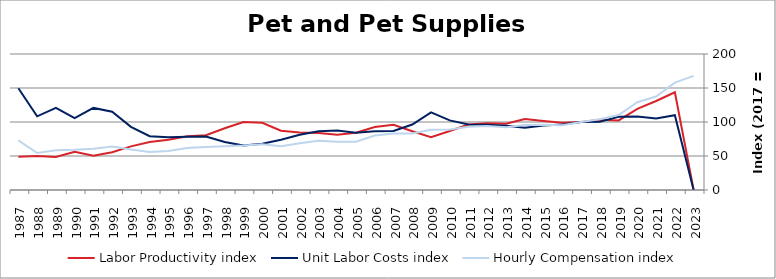
| Category | Labor Productivity index | Unit Labor Costs index | Hourly Compensation index |
|---|---|---|---|
| 2023.0 | 0 | 0 | 167.86 |
| 2022.0 | 143.663 | 109.898 | 157.882 |
| 2021.0 | 130.85 | 105.028 | 137.429 |
| 2020.0 | 119.413 | 108.161 | 129.158 |
| 2019.0 | 102.287 | 107.839 | 110.306 |
| 2018.0 | 103.461 | 100.489 | 103.966 |
| 2017.0 | 100 | 100 | 100 |
| 2016.0 | 98.8 | 96.414 | 95.257 |
| 2015.0 | 101.353 | 94.781 | 96.063 |
| 2014.0 | 104.391 | 91.651 | 95.676 |
| 2013.0 | 97.398 | 94.639 | 92.177 |
| 2012.0 | 98.152 | 96.026 | 94.252 |
| 2011.0 | 96.368 | 96.363 | 92.863 |
| 2010.0 | 86.851 | 102.331 | 88.876 |
| 2009.0 | 77.667 | 114.043 | 88.574 |
| 2008.0 | 86.406 | 96.242 | 83.159 |
| 2007.0 | 95.78 | 86.872 | 83.205 |
| 2006.0 | 92.64 | 86.439 | 80.077 |
| 2005.0 | 84.197 | 84.25 | 70.936 |
| 2004.0 | 81.286 | 87.359 | 71.011 |
| 2003.0 | 83.858 | 86.26 | 72.336 |
| 2002.0 | 84.494 | 81.213 | 68.62 |
| 2001.0 | 87.267 | 73.92 | 64.508 |
| 2000.0 | 98.875 | 68.101 | 67.334 |
| 1999.0 | 99.939 | 65.429 | 65.389 |
| 1998.0 | 90.792 | 70.713 | 64.202 |
| 1997.0 | 80.471 | 78.704 | 63.333 |
| 1996.0 | 78.899 | 78.226 | 61.72 |
| 1995.0 | 73.876 | 77.546 | 57.288 |
| 1994.0 | 70.672 | 79.177 | 55.956 |
| 1993.0 | 64.148 | 92.971 | 59.639 |
| 1992.0 | 55.488 | 115.124 | 63.88 |
| 1991.0 | 50.347 | 120.701 | 60.769 |
| 1990.0 | 56.145 | 105.676 | 59.332 |
| 1989.0 | 48.536 | 120.674 | 58.57 |
| 1988.0 | 50.141 | 108.396 | 54.35 |
| 1987.0 | 48.856 | 149.603 | 73.09 |